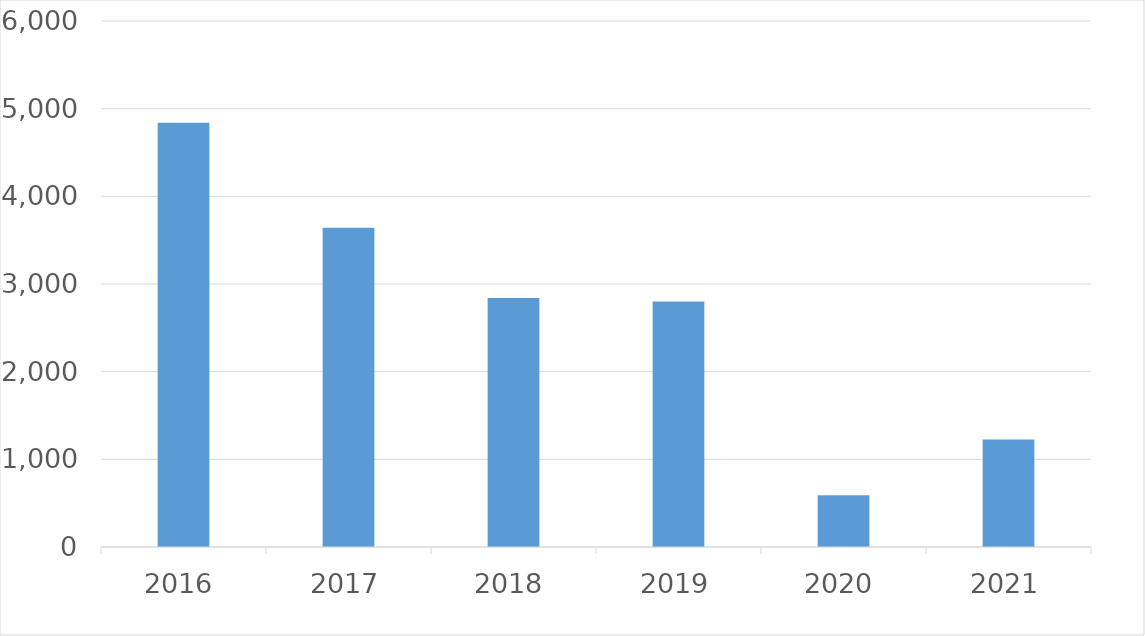
| Category | Series 0 |
|---|---|
| 2016 | 4839 |
| 2017 | 3643 |
| 2018 | 2841 |
| 2019 | 2801 |
| 2020 | 591 |
| 2021 | 1227 |